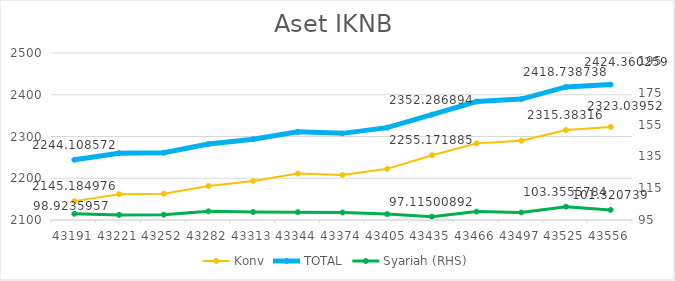
| Category | Konv | TOTAL |
|---|---|---|
| 43191.0 | 2145.185 | 2244.109 |
| 43221.0 | 2161.828 | 2260.043 |
| 43252.0 | 2162.818 | 2261.154 |
| 43282.0 | 2181.39 | 2281.837 |
| 43313.0 | 2193.55 | 2293.599 |
| 43344.0 | 2211.208 | 2311.146 |
| 43374.0 | 2207.768 | 2307.509 |
| 43405.0 | 2222.478 | 2321.18 |
| 43435.0 | 2255.172 | 2352.287 |
| 43466.0 | 2283.536 | 2383.836 |
| 43497.0 | 2289.807 | 2389.536 |
| 43525.0 | 2315.383 | 2418.739 |
| 43556.0 | 2323.04 | 2424.36 |